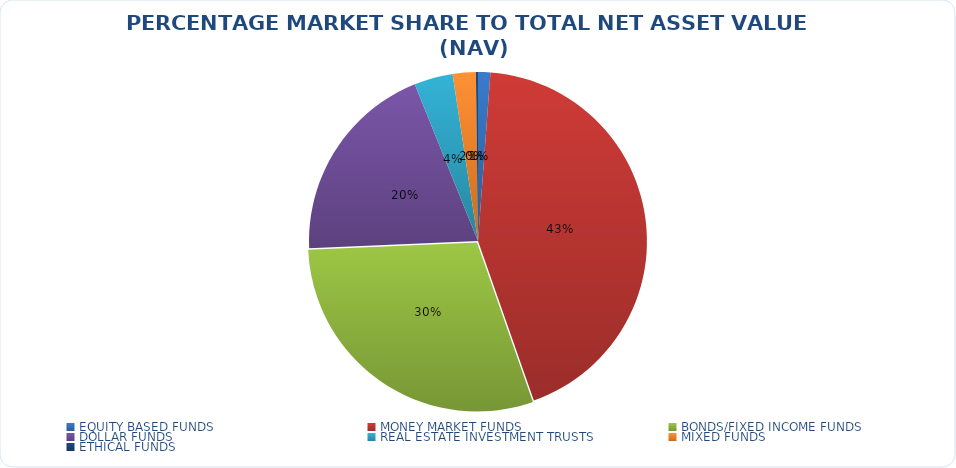
| Category | NET ASSET VALUE |
|---|---|
| EQUITY BASED FUNDS | 15824329759.223 |
| MONEY MARKET FUNDS | 585596881623.12 |
| BONDS/FIXED INCOME FUNDS | 399827914459.65 |
| DOLLAR FUNDS | 263761818695.848 |
| REAL ESTATE INVESTMENT TRUSTS | 49846110899.57 |
| MIXED FUNDS | 29760525522.736 |
| ETHICAL FUNDS | 2654036382.61 |